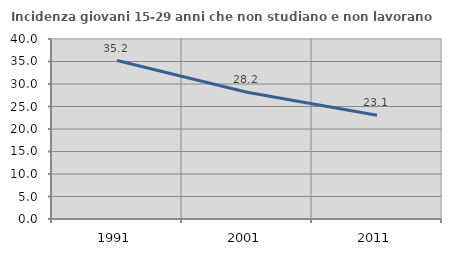
| Category | Incidenza giovani 15-29 anni che non studiano e non lavorano  |
|---|---|
| 1991.0 | 35.22 |
| 2001.0 | 28.155 |
| 2011.0 | 23.077 |